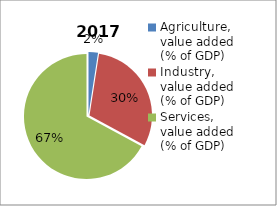
| Category | 2017 |
|---|---|
| Agriculture, value added (% of GDP)  | 2.444 |
| Industry, value added (% of GDP) | 30.42 |
| Services, value added (% of GDP) | 67.137 |